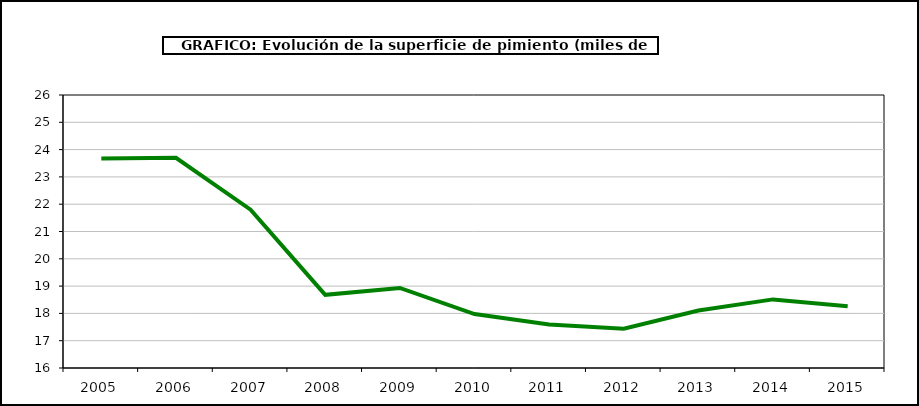
| Category | superficie |
|---|---|
| 2005.0 | 23.672 |
| 2006.0 | 23.699 |
| 2007.0 | 21.798 |
| 2008.0 | 18.681 |
| 2009.0 | 18.931 |
| 2010.0 | 17.975 |
| 2011.0 | 17.595 |
| 2012.0 | 17.44 |
| 2013.0 | 18.108 |
| 2014.0 | 18.513 |
| 2015.0 | 18.263 |